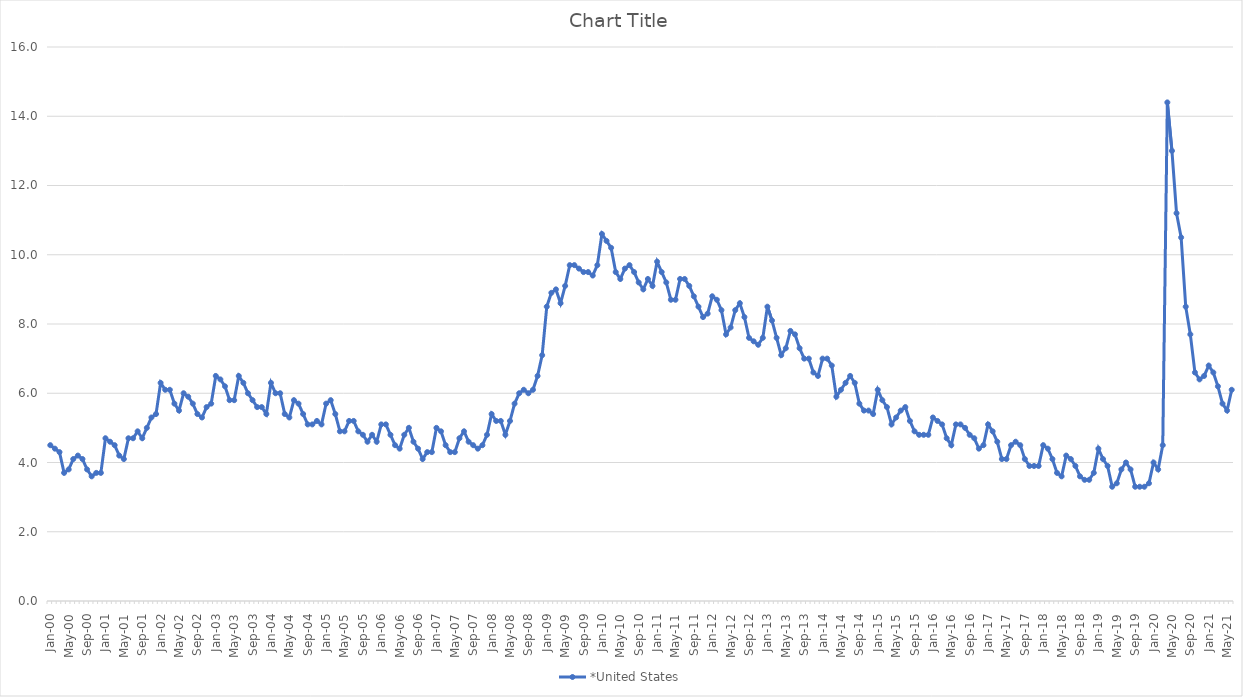
| Category | *United States | Alaska | Alabama | Arkansas | Arizona | California | Colorado | Connecticut | Delaware | Florida | Georgia | Hawaii | Iowa | Idaho | Illinois | Indiana | Kansas | Kentucky | Louisiana | Massachusetts | Maryland | Maine | Michigan | Minnesota | Missouri | Mississippi | Montana | North Carolina | North Dakota | Nebraska | New Hampshire | New Jersey | New Mexico | Nevada | New York | Ohio | Oklahoma | Oregon | Pennsylvania | Rhode Island | South Carolina | South Dakota | Tennessee | Texas | Utah | Virginia | Vermont | Washington | Wisconsin | West Virginia | Wyoming |
|---|---|---|---|---|---|---|---|---|---|---|---|---|---|---|---|---|---|---|---|---|---|---|---|---|---|---|---|---|---|---|---|---|---|---|---|---|---|---|---|---|---|---|---|---|---|---|---|---|---|---|---|
| Jan-00 | 4.5 |  |  |  |  |  |  |  |  |  |  |  |  |  |  |  |  |  |  |  |  |  |  |  |  |  |  |  |  |  |  |  |  |  |  |  |  |  |  |  |  |  |  |  |  |  |  |  |  |  |  |
| Feb-00 | 4.4 |  |  |  |  |  |  |  |  |  |  |  |  |  |  |  |  |  |  |  |  |  |  |  |  |  |  |  |  |  |  |  |  |  |  |  |  |  |  |  |  |  |  |  |  |  |  |  |  |  |  |
| Mar-00 | 4.3 |  |  |  |  |  |  |  |  |  |  |  |  |  |  |  |  |  |  |  |  |  |  |  |  |  |  |  |  |  |  |  |  |  |  |  |  |  |  |  |  |  |  |  |  |  |  |  |  |  |  |
| Apr-00 | 3.7 |  |  |  |  |  |  |  |  |  |  |  |  |  |  |  |  |  |  |  |  |  |  |  |  |  |  |  |  |  |  |  |  |  |  |  |  |  |  |  |  |  |  |  |  |  |  |  |  |  |  |
| May-00 | 3.8 |  |  |  |  |  |  |  |  |  |  |  |  |  |  |  |  |  |  |  |  |  |  |  |  |  |  |  |  |  |  |  |  |  |  |  |  |  |  |  |  |  |  |  |  |  |  |  |  |  |  |
| Jun-00 | 4.1 |  |  |  |  |  |  |  |  |  |  |  |  |  |  |  |  |  |  |  |  |  |  |  |  |  |  |  |  |  |  |  |  |  |  |  |  |  |  |  |  |  |  |  |  |  |  |  |  |  |  |
| Jul-00 | 4.2 |  |  |  |  |  |  |  |  |  |  |  |  |  |  |  |  |  |  |  |  |  |  |  |  |  |  |  |  |  |  |  |  |  |  |  |  |  |  |  |  |  |  |  |  |  |  |  |  |  |  |
| Aug-00 | 4.1 |  |  |  |  |  |  |  |  |  |  |  |  |  |  |  |  |  |  |  |  |  |  |  |  |  |  |  |  |  |  |  |  |  |  |  |  |  |  |  |  |  |  |  |  |  |  |  |  |  |  |
| Sep-00 | 3.8 |  |  |  |  |  |  |  |  |  |  |  |  |  |  |  |  |  |  |  |  |  |  |  |  |  |  |  |  |  |  |  |  |  |  |  |  |  |  |  |  |  |  |  |  |  |  |  |  |  |  |
| Oct-00 | 3.6 |  |  |  |  |  |  |  |  |  |  |  |  |  |  |  |  |  |  |  |  |  |  |  |  |  |  |  |  |  |  |  |  |  |  |  |  |  |  |  |  |  |  |  |  |  |  |  |  |  |  |
| Nov-00 | 3.7 |  |  |  |  |  |  |  |  |  |  |  |  |  |  |  |  |  |  |  |  |  |  |  |  |  |  |  |  |  |  |  |  |  |  |  |  |  |  |  |  |  |  |  |  |  |  |  |  |  |  |
| Dec-00 | 3.7 |  |  |  |  |  |  |  |  |  |  |  |  |  |  |  |  |  |  |  |  |  |  |  |  |  |  |  |  |  |  |  |  |  |  |  |  |  |  |  |  |  |  |  |  |  |  |  |  |  |  |
| Jan-01 | 4.7 |  |  |  |  |  |  |  |  |  |  |  |  |  |  |  |  |  |  |  |  |  |  |  |  |  |  |  |  |  |  |  |  |  |  |  |  |  |  |  |  |  |  |  |  |  |  |  |  |  |  |
| Feb-01 | 4.6 |  |  |  |  |  |  |  |  |  |  |  |  |  |  |  |  |  |  |  |  |  |  |  |  |  |  |  |  |  |  |  |  |  |  |  |  |  |  |  |  |  |  |  |  |  |  |  |  |  |  |
| Mar-01 | 4.5 |  |  |  |  |  |  |  |  |  |  |  |  |  |  |  |  |  |  |  |  |  |  |  |  |  |  |  |  |  |  |  |  |  |  |  |  |  |  |  |  |  |  |  |  |  |  |  |  |  |  |
| Apr-01 | 4.2 |  |  |  |  |  |  |  |  |  |  |  |  |  |  |  |  |  |  |  |  |  |  |  |  |  |  |  |  |  |  |  |  |  |  |  |  |  |  |  |  |  |  |  |  |  |  |  |  |  |  |
| May-01 | 4.1 |  |  |  |  |  |  |  |  |  |  |  |  |  |  |  |  |  |  |  |  |  |  |  |  |  |  |  |  |  |  |  |  |  |  |  |  |  |  |  |  |  |  |  |  |  |  |  |  |  |  |
| Jun-01 | 4.7 |  |  |  |  |  |  |  |  |  |  |  |  |  |  |  |  |  |  |  |  |  |  |  |  |  |  |  |  |  |  |  |  |  |  |  |  |  |  |  |  |  |  |  |  |  |  |  |  |  |  |
| Jul-01 | 4.7 |  |  |  |  |  |  |  |  |  |  |  |  |  |  |  |  |  |  |  |  |  |  |  |  |  |  |  |  |  |  |  |  |  |  |  |  |  |  |  |  |  |  |  |  |  |  |  |  |  |  |
| Aug-01 | 4.9 |  |  |  |  |  |  |  |  |  |  |  |  |  |  |  |  |  |  |  |  |  |  |  |  |  |  |  |  |  |  |  |  |  |  |  |  |  |  |  |  |  |  |  |  |  |  |  |  |  |  |
| Sep-01 | 4.7 |  |  |  |  |  |  |  |  |  |  |  |  |  |  |  |  |  |  |  |  |  |  |  |  |  |  |  |  |  |  |  |  |  |  |  |  |  |  |  |  |  |  |  |  |  |  |  |  |  |  |
| Oct-01 | 5 |  |  |  |  |  |  |  |  |  |  |  |  |  |  |  |  |  |  |  |  |  |  |  |  |  |  |  |  |  |  |  |  |  |  |  |  |  |  |  |  |  |  |  |  |  |  |  |  |  |  |
| Nov-01 | 5.3 |  |  |  |  |  |  |  |  |  |  |  |  |  |  |  |  |  |  |  |  |  |  |  |  |  |  |  |  |  |  |  |  |  |  |  |  |  |  |  |  |  |  |  |  |  |  |  |  |  |  |
| Dec-01 | 5.4 |  |  |  |  |  |  |  |  |  |  |  |  |  |  |  |  |  |  |  |  |  |  |  |  |  |  |  |  |  |  |  |  |  |  |  |  |  |  |  |  |  |  |  |  |  |  |  |  |  |  |
| Jan-02 | 6.3 |  |  |  |  |  |  |  |  |  |  |  |  |  |  |  |  |  |  |  |  |  |  |  |  |  |  |  |  |  |  |  |  |  |  |  |  |  |  |  |  |  |  |  |  |  |  |  |  |  |  |
| Feb-02 | 6.1 |  |  |  |  |  |  |  |  |  |  |  |  |  |  |  |  |  |  |  |  |  |  |  |  |  |  |  |  |  |  |  |  |  |  |  |  |  |  |  |  |  |  |  |  |  |  |  |  |  |  |
| Mar-02 | 6.1 |  |  |  |  |  |  |  |  |  |  |  |  |  |  |  |  |  |  |  |  |  |  |  |  |  |  |  |  |  |  |  |  |  |  |  |  |  |  |  |  |  |  |  |  |  |  |  |  |  |  |
| Apr-02 | 5.7 |  |  |  |  |  |  |  |  |  |  |  |  |  |  |  |  |  |  |  |  |  |  |  |  |  |  |  |  |  |  |  |  |  |  |  |  |  |  |  |  |  |  |  |  |  |  |  |  |  |  |
| May-02 | 5.5 |  |  |  |  |  |  |  |  |  |  |  |  |  |  |  |  |  |  |  |  |  |  |  |  |  |  |  |  |  |  |  |  |  |  |  |  |  |  |  |  |  |  |  |  |  |  |  |  |  |  |
| Jun-02 | 6 |  |  |  |  |  |  |  |  |  |  |  |  |  |  |  |  |  |  |  |  |  |  |  |  |  |  |  |  |  |  |  |  |  |  |  |  |  |  |  |  |  |  |  |  |  |  |  |  |  |  |
| Jul-02 | 5.9 |  |  |  |  |  |  |  |  |  |  |  |  |  |  |  |  |  |  |  |  |  |  |  |  |  |  |  |  |  |  |  |  |  |  |  |  |  |  |  |  |  |  |  |  |  |  |  |  |  |  |
| Aug-02 | 5.7 |  |  |  |  |  |  |  |  |  |  |  |  |  |  |  |  |  |  |  |  |  |  |  |  |  |  |  |  |  |  |  |  |  |  |  |  |  |  |  |  |  |  |  |  |  |  |  |  |  |  |
| Sep-02 | 5.4 |  |  |  |  |  |  |  |  |  |  |  |  |  |  |  |  |  |  |  |  |  |  |  |  |  |  |  |  |  |  |  |  |  |  |  |  |  |  |  |  |  |  |  |  |  |  |  |  |  |  |
| Oct-02 | 5.3 |  |  |  |  |  |  |  |  |  |  |  |  |  |  |  |  |  |  |  |  |  |  |  |  |  |  |  |  |  |  |  |  |  |  |  |  |  |  |  |  |  |  |  |  |  |  |  |  |  |  |
| Nov-02 | 5.6 |  |  |  |  |  |  |  |  |  |  |  |  |  |  |  |  |  |  |  |  |  |  |  |  |  |  |  |  |  |  |  |  |  |  |  |  |  |  |  |  |  |  |  |  |  |  |  |  |  |  |
| Dec-02 | 5.7 |  |  |  |  |  |  |  |  |  |  |  |  |  |  |  |  |  |  |  |  |  |  |  |  |  |  |  |  |  |  |  |  |  |  |  |  |  |  |  |  |  |  |  |  |  |  |  |  |  |  |
| Jan-03 | 6.5 |  |  |  |  |  |  |  |  |  |  |  |  |  |  |  |  |  |  |  |  |  |  |  |  |  |  |  |  |  |  |  |  |  |  |  |  |  |  |  |  |  |  |  |  |  |  |  |  |  |  |
| Feb-03 | 6.4 |  |  |  |  |  |  |  |  |  |  |  |  |  |  |  |  |  |  |  |  |  |  |  |  |  |  |  |  |  |  |  |  |  |  |  |  |  |  |  |  |  |  |  |  |  |  |  |  |  |  |
| Mar-03 | 6.2 |  |  |  |  |  |  |  |  |  |  |  |  |  |  |  |  |  |  |  |  |  |  |  |  |  |  |  |  |  |  |  |  |  |  |  |  |  |  |  |  |  |  |  |  |  |  |  |  |  |  |
| Apr-03 | 5.8 |  |  |  |  |  |  |  |  |  |  |  |  |  |  |  |  |  |  |  |  |  |  |  |  |  |  |  |  |  |  |  |  |  |  |  |  |  |  |  |  |  |  |  |  |  |  |  |  |  |  |
| May-03 | 5.8 |  |  |  |  |  |  |  |  |  |  |  |  |  |  |  |  |  |  |  |  |  |  |  |  |  |  |  |  |  |  |  |  |  |  |  |  |  |  |  |  |  |  |  |  |  |  |  |  |  |  |
| Jun-03 | 6.5 |  |  |  |  |  |  |  |  |  |  |  |  |  |  |  |  |  |  |  |  |  |  |  |  |  |  |  |  |  |  |  |  |  |  |  |  |  |  |  |  |  |  |  |  |  |  |  |  |  |  |
| Jul-03 | 6.3 |  |  |  |  |  |  |  |  |  |  |  |  |  |  |  |  |  |  |  |  |  |  |  |  |  |  |  |  |  |  |  |  |  |  |  |  |  |  |  |  |  |  |  |  |  |  |  |  |  |  |
| Aug-03 | 6 |  |  |  |  |  |  |  |  |  |  |  |  |  |  |  |  |  |  |  |  |  |  |  |  |  |  |  |  |  |  |  |  |  |  |  |  |  |  |  |  |  |  |  |  |  |  |  |  |  |  |
| Sep-03 | 5.8 |  |  |  |  |  |  |  |  |  |  |  |  |  |  |  |  |  |  |  |  |  |  |  |  |  |  |  |  |  |  |  |  |  |  |  |  |  |  |  |  |  |  |  |  |  |  |  |  |  |  |
| Oct-03 | 5.6 |  |  |  |  |  |  |  |  |  |  |  |  |  |  |  |  |  |  |  |  |  |  |  |  |  |  |  |  |  |  |  |  |  |  |  |  |  |  |  |  |  |  |  |  |  |  |  |  |  |  |
| Nov-03 | 5.6 |  |  |  |  |  |  |  |  |  |  |  |  |  |  |  |  |  |  |  |  |  |  |  |  |  |  |  |  |  |  |  |  |  |  |  |  |  |  |  |  |  |  |  |  |  |  |  |  |  |  |
| Dec-03 | 5.4 |  |  |  |  |  |  |  |  |  |  |  |  |  |  |  |  |  |  |  |  |  |  |  |  |  |  |  |  |  |  |  |  |  |  |  |  |  |  |  |  |  |  |  |  |  |  |  |  |  |  |
| Jan-04 | 6.3 |  |  |  |  |  |  |  |  |  |  |  |  |  |  |  |  |  |  |  |  |  |  |  |  |  |  |  |  |  |  |  |  |  |  |  |  |  |  |  |  |  |  |  |  |  |  |  |  |  |  |
| Feb-04 | 6 |  |  |  |  |  |  |  |  |  |  |  |  |  |  |  |  |  |  |  |  |  |  |  |  |  |  |  |  |  |  |  |  |  |  |  |  |  |  |  |  |  |  |  |  |  |  |  |  |  |  |
| Mar-04 | 6 |  |  |  |  |  |  |  |  |  |  |  |  |  |  |  |  |  |  |  |  |  |  |  |  |  |  |  |  |  |  |  |  |  |  |  |  |  |  |  |  |  |  |  |  |  |  |  |  |  |  |
| Apr-04 | 5.4 |  |  |  |  |  |  |  |  |  |  |  |  |  |  |  |  |  |  |  |  |  |  |  |  |  |  |  |  |  |  |  |  |  |  |  |  |  |  |  |  |  |  |  |  |  |  |  |  |  |  |
| May-04 | 5.3 |  |  |  |  |  |  |  |  |  |  |  |  |  |  |  |  |  |  |  |  |  |  |  |  |  |  |  |  |  |  |  |  |  |  |  |  |  |  |  |  |  |  |  |  |  |  |  |  |  |  |
| Jun-04 | 5.8 |  |  |  |  |  |  |  |  |  |  |  |  |  |  |  |  |  |  |  |  |  |  |  |  |  |  |  |  |  |  |  |  |  |  |  |  |  |  |  |  |  |  |  |  |  |  |  |  |  |  |
| Jul-04 | 5.7 |  |  |  |  |  |  |  |  |  |  |  |  |  |  |  |  |  |  |  |  |  |  |  |  |  |  |  |  |  |  |  |  |  |  |  |  |  |  |  |  |  |  |  |  |  |  |  |  |  |  |
| Aug-04 | 5.4 |  |  |  |  |  |  |  |  |  |  |  |  |  |  |  |  |  |  |  |  |  |  |  |  |  |  |  |  |  |  |  |  |  |  |  |  |  |  |  |  |  |  |  |  |  |  |  |  |  |  |
| Sep-04 | 5.1 |  |  |  |  |  |  |  |  |  |  |  |  |  |  |  |  |  |  |  |  |  |  |  |  |  |  |  |  |  |  |  |  |  |  |  |  |  |  |  |  |  |  |  |  |  |  |  |  |  |  |
| Oct-04 | 5.1 |  |  |  |  |  |  |  |  |  |  |  |  |  |  |  |  |  |  |  |  |  |  |  |  |  |  |  |  |  |  |  |  |  |  |  |  |  |  |  |  |  |  |  |  |  |  |  |  |  |  |
| Nov-04 | 5.2 |  |  |  |  |  |  |  |  |  |  |  |  |  |  |  |  |  |  |  |  |  |  |  |  |  |  |  |  |  |  |  |  |  |  |  |  |  |  |  |  |  |  |  |  |  |  |  |  |  |  |
| Dec-04 | 5.1 |  |  |  |  |  |  |  |  |  |  |  |  |  |  |  |  |  |  |  |  |  |  |  |  |  |  |  |  |  |  |  |  |  |  |  |  |  |  |  |  |  |  |  |  |  |  |  |  |  |  |
| Jan-05 | 5.7 |  |  |  |  |  |  |  |  |  |  |  |  |  |  |  |  |  |  |  |  |  |  |  |  |  |  |  |  |  |  |  |  |  |  |  |  |  |  |  |  |  |  |  |  |  |  |  |  |  |  |
| Feb-05 | 5.8 |  |  |  |  |  |  |  |  |  |  |  |  |  |  |  |  |  |  |  |  |  |  |  |  |  |  |  |  |  |  |  |  |  |  |  |  |  |  |  |  |  |  |  |  |  |  |  |  |  |  |
| Mar-05 | 5.4 |  |  |  |  |  |  |  |  |  |  |  |  |  |  |  |  |  |  |  |  |  |  |  |  |  |  |  |  |  |  |  |  |  |  |  |  |  |  |  |  |  |  |  |  |  |  |  |  |  |  |
| Apr-05 | 4.9 |  |  |  |  |  |  |  |  |  |  |  |  |  |  |  |  |  |  |  |  |  |  |  |  |  |  |  |  |  |  |  |  |  |  |  |  |  |  |  |  |  |  |  |  |  |  |  |  |  |  |
| May-05 | 4.9 |  |  |  |  |  |  |  |  |  |  |  |  |  |  |  |  |  |  |  |  |  |  |  |  |  |  |  |  |  |  |  |  |  |  |  |  |  |  |  |  |  |  |  |  |  |  |  |  |  |  |
| Jun-05 | 5.2 |  |  |  |  |  |  |  |  |  |  |  |  |  |  |  |  |  |  |  |  |  |  |  |  |  |  |  |  |  |  |  |  |  |  |  |  |  |  |  |  |  |  |  |  |  |  |  |  |  |  |
| Jul-05 | 5.2 |  |  |  |  |  |  |  |  |  |  |  |  |  |  |  |  |  |  |  |  |  |  |  |  |  |  |  |  |  |  |  |  |  |  |  |  |  |  |  |  |  |  |  |  |  |  |  |  |  |  |
| Aug-05 | 4.9 |  |  |  |  |  |  |  |  |  |  |  |  |  |  |  |  |  |  |  |  |  |  |  |  |  |  |  |  |  |  |  |  |  |  |  |  |  |  |  |  |  |  |  |  |  |  |  |  |  |  |
| Sep-05 | 4.8 |  |  |  |  |  |  |  |  |  |  |  |  |  |  |  |  |  |  |  |  |  |  |  |  |  |  |  |  |  |  |  |  |  |  |  |  |  |  |  |  |  |  |  |  |  |  |  |  |  |  |
| Oct-05 | 4.6 |  |  |  |  |  |  |  |  |  |  |  |  |  |  |  |  |  |  |  |  |  |  |  |  |  |  |  |  |  |  |  |  |  |  |  |  |  |  |  |  |  |  |  |  |  |  |  |  |  |  |
| Nov-05 | 4.8 |  |  |  |  |  |  |  |  |  |  |  |  |  |  |  |  |  |  |  |  |  |  |  |  |  |  |  |  |  |  |  |  |  |  |  |  |  |  |  |  |  |  |  |  |  |  |  |  |  |  |
| Dec-05 | 4.6 |  |  |  |  |  |  |  |  |  |  |  |  |  |  |  |  |  |  |  |  |  |  |  |  |  |  |  |  |  |  |  |  |  |  |  |  |  |  |  |  |  |  |  |  |  |  |  |  |  |  |
| Jan-06 | 5.1 |  |  |  |  |  |  |  |  |  |  |  |  |  |  |  |  |  |  |  |  |  |  |  |  |  |  |  |  |  |  |  |  |  |  |  |  |  |  |  |  |  |  |  |  |  |  |  |  |  |  |
| Feb-06 | 5.1 |  |  |  |  |  |  |  |  |  |  |  |  |  |  |  |  |  |  |  |  |  |  |  |  |  |  |  |  |  |  |  |  |  |  |  |  |  |  |  |  |  |  |  |  |  |  |  |  |  |  |
| Mar-06 | 4.8 |  |  |  |  |  |  |  |  |  |  |  |  |  |  |  |  |  |  |  |  |  |  |  |  |  |  |  |  |  |  |  |  |  |  |  |  |  |  |  |  |  |  |  |  |  |  |  |  |  |  |
| Apr-06 | 4.5 |  |  |  |  |  |  |  |  |  |  |  |  |  |  |  |  |  |  |  |  |  |  |  |  |  |  |  |  |  |  |  |  |  |  |  |  |  |  |  |  |  |  |  |  |  |  |  |  |  |  |
| May-06 | 4.4 |  |  |  |  |  |  |  |  |  |  |  |  |  |  |  |  |  |  |  |  |  |  |  |  |  |  |  |  |  |  |  |  |  |  |  |  |  |  |  |  |  |  |  |  |  |  |  |  |  |  |
| Jun-06 | 4.8 |  |  |  |  |  |  |  |  |  |  |  |  |  |  |  |  |  |  |  |  |  |  |  |  |  |  |  |  |  |  |  |  |  |  |  |  |  |  |  |  |  |  |  |  |  |  |  |  |  |  |
| Jul-06 | 5 |  |  |  |  |  |  |  |  |  |  |  |  |  |  |  |  |  |  |  |  |  |  |  |  |  |  |  |  |  |  |  |  |  |  |  |  |  |  |  |  |  |  |  |  |  |  |  |  |  |  |
| Aug-06 | 4.6 |  |  |  |  |  |  |  |  |  |  |  |  |  |  |  |  |  |  |  |  |  |  |  |  |  |  |  |  |  |  |  |  |  |  |  |  |  |  |  |  |  |  |  |  |  |  |  |  |  |  |
| Sep-06 | 4.4 |  |  |  |  |  |  |  |  |  |  |  |  |  |  |  |  |  |  |  |  |  |  |  |  |  |  |  |  |  |  |  |  |  |  |  |  |  |  |  |  |  |  |  |  |  |  |  |  |  |  |
| Oct-06 | 4.1 |  |  |  |  |  |  |  |  |  |  |  |  |  |  |  |  |  |  |  |  |  |  |  |  |  |  |  |  |  |  |  |  |  |  |  |  |  |  |  |  |  |  |  |  |  |  |  |  |  |  |
| Nov-06 | 4.3 |  |  |  |  |  |  |  |  |  |  |  |  |  |  |  |  |  |  |  |  |  |  |  |  |  |  |  |  |  |  |  |  |  |  |  |  |  |  |  |  |  |  |  |  |  |  |  |  |  |  |
| Dec-06 | 4.3 |  |  |  |  |  |  |  |  |  |  |  |  |  |  |  |  |  |  |  |  |  |  |  |  |  |  |  |  |  |  |  |  |  |  |  |  |  |  |  |  |  |  |  |  |  |  |  |  |  |  |
| Jan-07 | 5 |  |  |  |  |  |  |  |  |  |  |  |  |  |  |  |  |  |  |  |  |  |  |  |  |  |  |  |  |  |  |  |  |  |  |  |  |  |  |  |  |  |  |  |  |  |  |  |  |  |  |
| Feb-07 | 4.9 |  |  |  |  |  |  |  |  |  |  |  |  |  |  |  |  |  |  |  |  |  |  |  |  |  |  |  |  |  |  |  |  |  |  |  |  |  |  |  |  |  |  |  |  |  |  |  |  |  |  |
| Mar-07 | 4.5 |  |  |  |  |  |  |  |  |  |  |  |  |  |  |  |  |  |  |  |  |  |  |  |  |  |  |  |  |  |  |  |  |  |  |  |  |  |  |  |  |  |  |  |  |  |  |  |  |  |  |
| Apr-07 | 4.3 |  |  |  |  |  |  |  |  |  |  |  |  |  |  |  |  |  |  |  |  |  |  |  |  |  |  |  |  |  |  |  |  |  |  |  |  |  |  |  |  |  |  |  |  |  |  |  |  |  |  |
| May-07 | 4.3 |  |  |  |  |  |  |  |  |  |  |  |  |  |  |  |  |  |  |  |  |  |  |  |  |  |  |  |  |  |  |  |  |  |  |  |  |  |  |  |  |  |  |  |  |  |  |  |  |  |  |
| Jun-07 | 4.7 |  |  |  |  |  |  |  |  |  |  |  |  |  |  |  |  |  |  |  |  |  |  |  |  |  |  |  |  |  |  |  |  |  |  |  |  |  |  |  |  |  |  |  |  |  |  |  |  |  |  |
| Jul-07 | 4.9 |  |  |  |  |  |  |  |  |  |  |  |  |  |  |  |  |  |  |  |  |  |  |  |  |  |  |  |  |  |  |  |  |  |  |  |  |  |  |  |  |  |  |  |  |  |  |  |  |  |  |
| Aug-07 | 4.6 |  |  |  |  |  |  |  |  |  |  |  |  |  |  |  |  |  |  |  |  |  |  |  |  |  |  |  |  |  |  |  |  |  |  |  |  |  |  |  |  |  |  |  |  |  |  |  |  |  |  |
| Sep-07 | 4.5 |  |  |  |  |  |  |  |  |  |  |  |  |  |  |  |  |  |  |  |  |  |  |  |  |  |  |  |  |  |  |  |  |  |  |  |  |  |  |  |  |  |  |  |  |  |  |  |  |  |  |
| Oct-07 | 4.4 |  |  |  |  |  |  |  |  |  |  |  |  |  |  |  |  |  |  |  |  |  |  |  |  |  |  |  |  |  |  |  |  |  |  |  |  |  |  |  |  |  |  |  |  |  |  |  |  |  |  |
| Nov-07 | 4.5 |  |  |  |  |  |  |  |  |  |  |  |  |  |  |  |  |  |  |  |  |  |  |  |  |  |  |  |  |  |  |  |  |  |  |  |  |  |  |  |  |  |  |  |  |  |  |  |  |  |  |
| Dec-07 | 4.8 |  |  |  |  |  |  |  |  |  |  |  |  |  |  |  |  |  |  |  |  |  |  |  |  |  |  |  |  |  |  |  |  |  |  |  |  |  |  |  |  |  |  |  |  |  |  |  |  |  |  |
| Jan-08 | 5.4 |  |  |  |  |  |  |  |  |  |  |  |  |  |  |  |  |  |  |  |  |  |  |  |  |  |  |  |  |  |  |  |  |  |  |  |  |  |  |  |  |  |  |  |  |  |  |  |  |  |  |
| Feb-08 | 5.2 |  |  |  |  |  |  |  |  |  |  |  |  |  |  |  |  |  |  |  |  |  |  |  |  |  |  |  |  |  |  |  |  |  |  |  |  |  |  |  |  |  |  |  |  |  |  |  |  |  |  |
| Mar-08 | 5.2 |  |  |  |  |  |  |  |  |  |  |  |  |  |  |  |  |  |  |  |  |  |  |  |  |  |  |  |  |  |  |  |  |  |  |  |  |  |  |  |  |  |  |  |  |  |  |  |  |  |  |
| Apr-08 | 4.8 |  |  |  |  |  |  |  |  |  |  |  |  |  |  |  |  |  |  |  |  |  |  |  |  |  |  |  |  |  |  |  |  |  |  |  |  |  |  |  |  |  |  |  |  |  |  |  |  |  |  |
| May-08 | 5.2 |  |  |  |  |  |  |  |  |  |  |  |  |  |  |  |  |  |  |  |  |  |  |  |  |  |  |  |  |  |  |  |  |  |  |  |  |  |  |  |  |  |  |  |  |  |  |  |  |  |  |
| Jun-08 | 5.7 |  |  |  |  |  |  |  |  |  |  |  |  |  |  |  |  |  |  |  |  |  |  |  |  |  |  |  |  |  |  |  |  |  |  |  |  |  |  |  |  |  |  |  |  |  |  |  |  |  |  |
| Jul-08 | 6 |  |  |  |  |  |  |  |  |  |  |  |  |  |  |  |  |  |  |  |  |  |  |  |  |  |  |  |  |  |  |  |  |  |  |  |  |  |  |  |  |  |  |  |  |  |  |  |  |  |  |
| Aug-08 | 6.1 |  |  |  |  |  |  |  |  |  |  |  |  |  |  |  |  |  |  |  |  |  |  |  |  |  |  |  |  |  |  |  |  |  |  |  |  |  |  |  |  |  |  |  |  |  |  |  |  |  |  |
| Sep-08 | 6 |  |  |  |  |  |  |  |  |  |  |  |  |  |  |  |  |  |  |  |  |  |  |  |  |  |  |  |  |  |  |  |  |  |  |  |  |  |  |  |  |  |  |  |  |  |  |  |  |  |  |
| Oct-08 | 6.1 |  |  |  |  |  |  |  |  |  |  |  |  |  |  |  |  |  |  |  |  |  |  |  |  |  |  |  |  |  |  |  |  |  |  |  |  |  |  |  |  |  |  |  |  |  |  |  |  |  |  |
| Nov-08 | 6.5 |  |  |  |  |  |  |  |  |  |  |  |  |  |  |  |  |  |  |  |  |  |  |  |  |  |  |  |  |  |  |  |  |  |  |  |  |  |  |  |  |  |  |  |  |  |  |  |  |  |  |
| Dec-08 | 7.1 |  |  |  |  |  |  |  |  |  |  |  |  |  |  |  |  |  |  |  |  |  |  |  |  |  |  |  |  |  |  |  |  |  |  |  |  |  |  |  |  |  |  |  |  |  |  |  |  |  |  |
| Jan-09 | 8.5 |  |  |  |  |  |  |  |  |  |  |  |  |  |  |  |  |  |  |  |  |  |  |  |  |  |  |  |  |  |  |  |  |  |  |  |  |  |  |  |  |  |  |  |  |  |  |  |  |  |  |
| Feb-09 | 8.9 |  |  |  |  |  |  |  |  |  |  |  |  |  |  |  |  |  |  |  |  |  |  |  |  |  |  |  |  |  |  |  |  |  |  |  |  |  |  |  |  |  |  |  |  |  |  |  |  |  |  |
| Mar-09 | 9 |  |  |  |  |  |  |  |  |  |  |  |  |  |  |  |  |  |  |  |  |  |  |  |  |  |  |  |  |  |  |  |  |  |  |  |  |  |  |  |  |  |  |  |  |  |  |  |  |  |  |
| Apr-09 | 8.6 |  |  |  |  |  |  |  |  |  |  |  |  |  |  |  |  |  |  |  |  |  |  |  |  |  |  |  |  |  |  |  |  |  |  |  |  |  |  |  |  |  |  |  |  |  |  |  |  |  |  |
| May-09 | 9.1 |  |  |  |  |  |  |  |  |  |  |  |  |  |  |  |  |  |  |  |  |  |  |  |  |  |  |  |  |  |  |  |  |  |  |  |  |  |  |  |  |  |  |  |  |  |  |  |  |  |  |
| Jun-09 | 9.7 |  |  |  |  |  |  |  |  |  |  |  |  |  |  |  |  |  |  |  |  |  |  |  |  |  |  |  |  |  |  |  |  |  |  |  |  |  |  |  |  |  |  |  |  |  |  |  |  |  |  |
| Jul-09 | 9.7 |  |  |  |  |  |  |  |  |  |  |  |  |  |  |  |  |  |  |  |  |  |  |  |  |  |  |  |  |  |  |  |  |  |  |  |  |  |  |  |  |  |  |  |  |  |  |  |  |  |  |
| Aug-09 | 9.6 |  |  |  |  |  |  |  |  |  |  |  |  |  |  |  |  |  |  |  |  |  |  |  |  |  |  |  |  |  |  |  |  |  |  |  |  |  |  |  |  |  |  |  |  |  |  |  |  |  |  |
| Sep-09 | 9.5 |  |  |  |  |  |  |  |  |  |  |  |  |  |  |  |  |  |  |  |  |  |  |  |  |  |  |  |  |  |  |  |  |  |  |  |  |  |  |  |  |  |  |  |  |  |  |  |  |  |  |
| Oct-09 | 9.5 |  |  |  |  |  |  |  |  |  |  |  |  |  |  |  |  |  |  |  |  |  |  |  |  |  |  |  |  |  |  |  |  |  |  |  |  |  |  |  |  |  |  |  |  |  |  |  |  |  |  |
| Nov-09 | 9.4 |  |  |  |  |  |  |  |  |  |  |  |  |  |  |  |  |  |  |  |  |  |  |  |  |  |  |  |  |  |  |  |  |  |  |  |  |  |  |  |  |  |  |  |  |  |  |  |  |  |  |
| Dec-09 | 9.7 |  |  |  |  |  |  |  |  |  |  |  |  |  |  |  |  |  |  |  |  |  |  |  |  |  |  |  |  |  |  |  |  |  |  |  |  |  |  |  |  |  |  |  |  |  |  |  |  |  |  |
| Jan-10 | 10.6 |  |  |  |  |  |  |  |  |  |  |  |  |  |  |  |  |  |  |  |  |  |  |  |  |  |  |  |  |  |  |  |  |  |  |  |  |  |  |  |  |  |  |  |  |  |  |  |  |  |  |
| Feb-10 | 10.4 |  |  |  |  |  |  |  |  |  |  |  |  |  |  |  |  |  |  |  |  |  |  |  |  |  |  |  |  |  |  |  |  |  |  |  |  |  |  |  |  |  |  |  |  |  |  |  |  |  |  |
| Mar-10 | 10.2 |  |  |  |  |  |  |  |  |  |  |  |  |  |  |  |  |  |  |  |  |  |  |  |  |  |  |  |  |  |  |  |  |  |  |  |  |  |  |  |  |  |  |  |  |  |  |  |  |  |  |
| Apr-10 | 9.5 |  |  |  |  |  |  |  |  |  |  |  |  |  |  |  |  |  |  |  |  |  |  |  |  |  |  |  |  |  |  |  |  |  |  |  |  |  |  |  |  |  |  |  |  |  |  |  |  |  |  |
| May-10 | 9.3 |  |  |  |  |  |  |  |  |  |  |  |  |  |  |  |  |  |  |  |  |  |  |  |  |  |  |  |  |  |  |  |  |  |  |  |  |  |  |  |  |  |  |  |  |  |  |  |  |  |  |
| Jun-10 | 9.6 |  |  |  |  |  |  |  |  |  |  |  |  |  |  |  |  |  |  |  |  |  |  |  |  |  |  |  |  |  |  |  |  |  |  |  |  |  |  |  |  |  |  |  |  |  |  |  |  |  |  |
| Jul-10 | 9.7 |  |  |  |  |  |  |  |  |  |  |  |  |  |  |  |  |  |  |  |  |  |  |  |  |  |  |  |  |  |  |  |  |  |  |  |  |  |  |  |  |  |  |  |  |  |  |  |  |  |  |
| Aug-10 | 9.5 |  |  |  |  |  |  |  |  |  |  |  |  |  |  |  |  |  |  |  |  |  |  |  |  |  |  |  |  |  |  |  |  |  |  |  |  |  |  |  |  |  |  |  |  |  |  |  |  |  |  |
| Sep-10 | 9.2 |  |  |  |  |  |  |  |  |  |  |  |  |  |  |  |  |  |  |  |  |  |  |  |  |  |  |  |  |  |  |  |  |  |  |  |  |  |  |  |  |  |  |  |  |  |  |  |  |  |  |
| Oct-10 | 9 |  |  |  |  |  |  |  |  |  |  |  |  |  |  |  |  |  |  |  |  |  |  |  |  |  |  |  |  |  |  |  |  |  |  |  |  |  |  |  |  |  |  |  |  |  |  |  |  |  |  |
| Nov-10 | 9.3 |  |  |  |  |  |  |  |  |  |  |  |  |  |  |  |  |  |  |  |  |  |  |  |  |  |  |  |  |  |  |  |  |  |  |  |  |  |  |  |  |  |  |  |  |  |  |  |  |  |  |
| Dec-10 | 9.1 |  |  |  |  |  |  |  |  |  |  |  |  |  |  |  |  |  |  |  |  |  |  |  |  |  |  |  |  |  |  |  |  |  |  |  |  |  |  |  |  |  |  |  |  |  |  |  |  |  |  |
| Jan-11 | 9.8 |  |  |  |  |  |  |  |  |  |  |  |  |  |  |  |  |  |  |  |  |  |  |  |  |  |  |  |  |  |  |  |  |  |  |  |  |  |  |  |  |  |  |  |  |  |  |  |  |  |  |
| Feb-11 | 9.5 |  |  |  |  |  |  |  |  |  |  |  |  |  |  |  |  |  |  |  |  |  |  |  |  |  |  |  |  |  |  |  |  |  |  |  |  |  |  |  |  |  |  |  |  |  |  |  |  |  |  |
| Mar-11 | 9.2 |  |  |  |  |  |  |  |  |  |  |  |  |  |  |  |  |  |  |  |  |  |  |  |  |  |  |  |  |  |  |  |  |  |  |  |  |  |  |  |  |  |  |  |  |  |  |  |  |  |  |
| Apr-11 | 8.7 |  |  |  |  |  |  |  |  |  |  |  |  |  |  |  |  |  |  |  |  |  |  |  |  |  |  |  |  |  |  |  |  |  |  |  |  |  |  |  |  |  |  |  |  |  |  |  |  |  |  |
| May-11 | 8.7 |  |  |  |  |  |  |  |  |  |  |  |  |  |  |  |  |  |  |  |  |  |  |  |  |  |  |  |  |  |  |  |  |  |  |  |  |  |  |  |  |  |  |  |  |  |  |  |  |  |  |
| Jun-11 | 9.3 |  |  |  |  |  |  |  |  |  |  |  |  |  |  |  |  |  |  |  |  |  |  |  |  |  |  |  |  |  |  |  |  |  |  |  |  |  |  |  |  |  |  |  |  |  |  |  |  |  |  |
| Jul-11 | 9.3 |  |  |  |  |  |  |  |  |  |  |  |  |  |  |  |  |  |  |  |  |  |  |  |  |  |  |  |  |  |  |  |  |  |  |  |  |  |  |  |  |  |  |  |  |  |  |  |  |  |  |
| Aug-11 | 9.1 |  |  |  |  |  |  |  |  |  |  |  |  |  |  |  |  |  |  |  |  |  |  |  |  |  |  |  |  |  |  |  |  |  |  |  |  |  |  |  |  |  |  |  |  |  |  |  |  |  |  |
| Sep-11 | 8.8 |  |  |  |  |  |  |  |  |  |  |  |  |  |  |  |  |  |  |  |  |  |  |  |  |  |  |  |  |  |  |  |  |  |  |  |  |  |  |  |  |  |  |  |  |  |  |  |  |  |  |
| Oct-11 | 8.5 |  |  |  |  |  |  |  |  |  |  |  |  |  |  |  |  |  |  |  |  |  |  |  |  |  |  |  |  |  |  |  |  |  |  |  |  |  |  |  |  |  |  |  |  |  |  |  |  |  |  |
| Nov-11 | 8.2 |  |  |  |  |  |  |  |  |  |  |  |  |  |  |  |  |  |  |  |  |  |  |  |  |  |  |  |  |  |  |  |  |  |  |  |  |  |  |  |  |  |  |  |  |  |  |  |  |  |  |
| Dec-11 | 8.3 |  |  |  |  |  |  |  |  |  |  |  |  |  |  |  |  |  |  |  |  |  |  |  |  |  |  |  |  |  |  |  |  |  |  |  |  |  |  |  |  |  |  |  |  |  |  |  |  |  |  |
| Jan-12 | 8.8 |  |  |  |  |  |  |  |  |  |  |  |  |  |  |  |  |  |  |  |  |  |  |  |  |  |  |  |  |  |  |  |  |  |  |  |  |  |  |  |  |  |  |  |  |  |  |  |  |  |  |
| Feb-12 | 8.7 |  |  |  |  |  |  |  |  |  |  |  |  |  |  |  |  |  |  |  |  |  |  |  |  |  |  |  |  |  |  |  |  |  |  |  |  |  |  |  |  |  |  |  |  |  |  |  |  |  |  |
| Mar-12 | 8.4 |  |  |  |  |  |  |  |  |  |  |  |  |  |  |  |  |  |  |  |  |  |  |  |  |  |  |  |  |  |  |  |  |  |  |  |  |  |  |  |  |  |  |  |  |  |  |  |  |  |  |
| Apr-12 | 7.7 |  |  |  |  |  |  |  |  |  |  |  |  |  |  |  |  |  |  |  |  |  |  |  |  |  |  |  |  |  |  |  |  |  |  |  |  |  |  |  |  |  |  |  |  |  |  |  |  |  |  |
| May-12 | 7.9 |  |  |  |  |  |  |  |  |  |  |  |  |  |  |  |  |  |  |  |  |  |  |  |  |  |  |  |  |  |  |  |  |  |  |  |  |  |  |  |  |  |  |  |  |  |  |  |  |  |  |
| Jun-12 | 8.4 |  |  |  |  |  |  |  |  |  |  |  |  |  |  |  |  |  |  |  |  |  |  |  |  |  |  |  |  |  |  |  |  |  |  |  |  |  |  |  |  |  |  |  |  |  |  |  |  |  |  |
| Jul-12 | 8.6 |  |  |  |  |  |  |  |  |  |  |  |  |  |  |  |  |  |  |  |  |  |  |  |  |  |  |  |  |  |  |  |  |  |  |  |  |  |  |  |  |  |  |  |  |  |  |  |  |  |  |
| Aug-12 | 8.2 |  |  |  |  |  |  |  |  |  |  |  |  |  |  |  |  |  |  |  |  |  |  |  |  |  |  |  |  |  |  |  |  |  |  |  |  |  |  |  |  |  |  |  |  |  |  |  |  |  |  |
| Sep-12 | 7.6 |  |  |  |  |  |  |  |  |  |  |  |  |  |  |  |  |  |  |  |  |  |  |  |  |  |  |  |  |  |  |  |  |  |  |  |  |  |  |  |  |  |  |  |  |  |  |  |  |  |  |
| Oct-12 | 7.5 |  |  |  |  |  |  |  |  |  |  |  |  |  |  |  |  |  |  |  |  |  |  |  |  |  |  |  |  |  |  |  |  |  |  |  |  |  |  |  |  |  |  |  |  |  |  |  |  |  |  |
| Nov-12 | 7.4 |  |  |  |  |  |  |  |  |  |  |  |  |  |  |  |  |  |  |  |  |  |  |  |  |  |  |  |  |  |  |  |  |  |  |  |  |  |  |  |  |  |  |  |  |  |  |  |  |  |  |
| Dec-12 | 7.6 |  |  |  |  |  |  |  |  |  |  |  |  |  |  |  |  |  |  |  |  |  |  |  |  |  |  |  |  |  |  |  |  |  |  |  |  |  |  |  |  |  |  |  |  |  |  |  |  |  |  |
| Jan-13 | 8.5 |  |  |  |  |  |  |  |  |  |  |  |  |  |  |  |  |  |  |  |  |  |  |  |  |  |  |  |  |  |  |  |  |  |  |  |  |  |  |  |  |  |  |  |  |  |  |  |  |  |  |
| Feb-13 | 8.1 |  |  |  |  |  |  |  |  |  |  |  |  |  |  |  |  |  |  |  |  |  |  |  |  |  |  |  |  |  |  |  |  |  |  |  |  |  |  |  |  |  |  |  |  |  |  |  |  |  |  |
| Mar-13 | 7.6 |  |  |  |  |  |  |  |  |  |  |  |  |  |  |  |  |  |  |  |  |  |  |  |  |  |  |  |  |  |  |  |  |  |  |  |  |  |  |  |  |  |  |  |  |  |  |  |  |  |  |
| Apr-13 | 7.1 |  |  |  |  |  |  |  |  |  |  |  |  |  |  |  |  |  |  |  |  |  |  |  |  |  |  |  |  |  |  |  |  |  |  |  |  |  |  |  |  |  |  |  |  |  |  |  |  |  |  |
| May-13 | 7.3 |  |  |  |  |  |  |  |  |  |  |  |  |  |  |  |  |  |  |  |  |  |  |  |  |  |  |  |  |  |  |  |  |  |  |  |  |  |  |  |  |  |  |  |  |  |  |  |  |  |  |
| Jun-13 | 7.8 |  |  |  |  |  |  |  |  |  |  |  |  |  |  |  |  |  |  |  |  |  |  |  |  |  |  |  |  |  |  |  |  |  |  |  |  |  |  |  |  |  |  |  |  |  |  |  |  |  |  |
| Jul-13 | 7.7 |  |  |  |  |  |  |  |  |  |  |  |  |  |  |  |  |  |  |  |  |  |  |  |  |  |  |  |  |  |  |  |  |  |  |  |  |  |  |  |  |  |  |  |  |  |  |  |  |  |  |
| Aug-13 | 7.3 |  |  |  |  |  |  |  |  |  |  |  |  |  |  |  |  |  |  |  |  |  |  |  |  |  |  |  |  |  |  |  |  |  |  |  |  |  |  |  |  |  |  |  |  |  |  |  |  |  |  |
| Sep-13 | 7 |  |  |  |  |  |  |  |  |  |  |  |  |  |  |  |  |  |  |  |  |  |  |  |  |  |  |  |  |  |  |  |  |  |  |  |  |  |  |  |  |  |  |  |  |  |  |  |  |  |  |
| Oct-13 | 7 |  |  |  |  |  |  |  |  |  |  |  |  |  |  |  |  |  |  |  |  |  |  |  |  |  |  |  |  |  |  |  |  |  |  |  |  |  |  |  |  |  |  |  |  |  |  |  |  |  |  |
| Nov-13 | 6.6 |  |  |  |  |  |  |  |  |  |  |  |  |  |  |  |  |  |  |  |  |  |  |  |  |  |  |  |  |  |  |  |  |  |  |  |  |  |  |  |  |  |  |  |  |  |  |  |  |  |  |
| Dec-13 | 6.5 |  |  |  |  |  |  |  |  |  |  |  |  |  |  |  |  |  |  |  |  |  |  |  |  |  |  |  |  |  |  |  |  |  |  |  |  |  |  |  |  |  |  |  |  |  |  |  |  |  |  |
| Jan-14 | 7 |  |  |  |  |  |  |  |  |  |  |  |  |  |  |  |  |  |  |  |  |  |  |  |  |  |  |  |  |  |  |  |  |  |  |  |  |  |  |  |  |  |  |  |  |  |  |  |  |  |  |
| Feb-14 | 7 |  |  |  |  |  |  |  |  |  |  |  |  |  |  |  |  |  |  |  |  |  |  |  |  |  |  |  |  |  |  |  |  |  |  |  |  |  |  |  |  |  |  |  |  |  |  |  |  |  |  |
| Mar-14 | 6.8 |  |  |  |  |  |  |  |  |  |  |  |  |  |  |  |  |  |  |  |  |  |  |  |  |  |  |  |  |  |  |  |  |  |  |  |  |  |  |  |  |  |  |  |  |  |  |  |  |  |  |
| Apr-14 | 5.9 |  |  |  |  |  |  |  |  |  |  |  |  |  |  |  |  |  |  |  |  |  |  |  |  |  |  |  |  |  |  |  |  |  |  |  |  |  |  |  |  |  |  |  |  |  |  |  |  |  |  |
| May-14 | 6.1 |  |  |  |  |  |  |  |  |  |  |  |  |  |  |  |  |  |  |  |  |  |  |  |  |  |  |  |  |  |  |  |  |  |  |  |  |  |  |  |  |  |  |  |  |  |  |  |  |  |  |
| Jun-14 | 6.3 |  |  |  |  |  |  |  |  |  |  |  |  |  |  |  |  |  |  |  |  |  |  |  |  |  |  |  |  |  |  |  |  |  |  |  |  |  |  |  |  |  |  |  |  |  |  |  |  |  |  |
| Jul-14 | 6.5 |  |  |  |  |  |  |  |  |  |  |  |  |  |  |  |  |  |  |  |  |  |  |  |  |  |  |  |  |  |  |  |  |  |  |  |  |  |  |  |  |  |  |  |  |  |  |  |  |  |  |
| Aug-14 | 6.3 |  |  |  |  |  |  |  |  |  |  |  |  |  |  |  |  |  |  |  |  |  |  |  |  |  |  |  |  |  |  |  |  |  |  |  |  |  |  |  |  |  |  |  |  |  |  |  |  |  |  |
| Sep-14 | 5.7 |  |  |  |  |  |  |  |  |  |  |  |  |  |  |  |  |  |  |  |  |  |  |  |  |  |  |  |  |  |  |  |  |  |  |  |  |  |  |  |  |  |  |  |  |  |  |  |  |  |  |
| Oct-14 | 5.5 |  |  |  |  |  |  |  |  |  |  |  |  |  |  |  |  |  |  |  |  |  |  |  |  |  |  |  |  |  |  |  |  |  |  |  |  |  |  |  |  |  |  |  |  |  |  |  |  |  |  |
| Nov-14 | 5.5 |  |  |  |  |  |  |  |  |  |  |  |  |  |  |  |  |  |  |  |  |  |  |  |  |  |  |  |  |  |  |  |  |  |  |  |  |  |  |  |  |  |  |  |  |  |  |  |  |  |  |
| Dec-14 | 5.4 |  |  |  |  |  |  |  |  |  |  |  |  |  |  |  |  |  |  |  |  |  |  |  |  |  |  |  |  |  |  |  |  |  |  |  |  |  |  |  |  |  |  |  |  |  |  |  |  |  |  |
| Jan-15 | 6.1 |  |  |  |  |  |  |  |  |  |  |  |  |  |  |  |  |  |  |  |  |  |  |  |  |  |  |  |  |  |  |  |  |  |  |  |  |  |  |  |  |  |  |  |  |  |  |  |  |  |  |
| Feb-15 | 5.8 |  |  |  |  |  |  |  |  |  |  |  |  |  |  |  |  |  |  |  |  |  |  |  |  |  |  |  |  |  |  |  |  |  |  |  |  |  |  |  |  |  |  |  |  |  |  |  |  |  |  |
| Mar-15 | 5.6 |  |  |  |  |  |  |  |  |  |  |  |  |  |  |  |  |  |  |  |  |  |  |  |  |  |  |  |  |  |  |  |  |  |  |  |  |  |  |  |  |  |  |  |  |  |  |  |  |  |  |
| Apr-15 | 5.1 |  |  |  |  |  |  |  |  |  |  |  |  |  |  |  |  |  |  |  |  |  |  |  |  |  |  |  |  |  |  |  |  |  |  |  |  |  |  |  |  |  |  |  |  |  |  |  |  |  |  |
| May-15 | 5.3 |  |  |  |  |  |  |  |  |  |  |  |  |  |  |  |  |  |  |  |  |  |  |  |  |  |  |  |  |  |  |  |  |  |  |  |  |  |  |  |  |  |  |  |  |  |  |  |  |  |  |
| Jun-15 | 5.5 |  |  |  |  |  |  |  |  |  |  |  |  |  |  |  |  |  |  |  |  |  |  |  |  |  |  |  |  |  |  |  |  |  |  |  |  |  |  |  |  |  |  |  |  |  |  |  |  |  |  |
| Jul-15 | 5.6 |  |  |  |  |  |  |  |  |  |  |  |  |  |  |  |  |  |  |  |  |  |  |  |  |  |  |  |  |  |  |  |  |  |  |  |  |  |  |  |  |  |  |  |  |  |  |  |  |  |  |
| Aug-15 | 5.2 |  |  |  |  |  |  |  |  |  |  |  |  |  |  |  |  |  |  |  |  |  |  |  |  |  |  |  |  |  |  |  |  |  |  |  |  |  |  |  |  |  |  |  |  |  |  |  |  |  |  |
| Sep-15 | 4.9 |  |  |  |  |  |  |  |  |  |  |  |  |  |  |  |  |  |  |  |  |  |  |  |  |  |  |  |  |  |  |  |  |  |  |  |  |  |  |  |  |  |  |  |  |  |  |  |  |  |  |
| Oct-15 | 4.8 |  |  |  |  |  |  |  |  |  |  |  |  |  |  |  |  |  |  |  |  |  |  |  |  |  |  |  |  |  |  |  |  |  |  |  |  |  |  |  |  |  |  |  |  |  |  |  |  |  |  |
| Nov-15 | 4.8 |  |  |  |  |  |  |  |  |  |  |  |  |  |  |  |  |  |  |  |  |  |  |  |  |  |  |  |  |  |  |  |  |  |  |  |  |  |  |  |  |  |  |  |  |  |  |  |  |  |  |
| Dec-15 | 4.8 |  |  |  |  |  |  |  |  |  |  |  |  |  |  |  |  |  |  |  |  |  |  |  |  |  |  |  |  |  |  |  |  |  |  |  |  |  |  |  |  |  |  |  |  |  |  |  |  |  |  |
| Jan-16 | 5.3 |  |  |  |  |  |  |  |  |  |  |  |  |  |  |  |  |  |  |  |  |  |  |  |  |  |  |  |  |  |  |  |  |  |  |  |  |  |  |  |  |  |  |  |  |  |  |  |  |  |  |
| Feb-16 | 5.2 |  |  |  |  |  |  |  |  |  |  |  |  |  |  |  |  |  |  |  |  |  |  |  |  |  |  |  |  |  |  |  |  |  |  |  |  |  |  |  |  |  |  |  |  |  |  |  |  |  |  |
| Mar-16 | 5.1 |  |  |  |  |  |  |  |  |  |  |  |  |  |  |  |  |  |  |  |  |  |  |  |  |  |  |  |  |  |  |  |  |  |  |  |  |  |  |  |  |  |  |  |  |  |  |  |  |  |  |
| Apr-16 | 4.7 |  |  |  |  |  |  |  |  |  |  |  |  |  |  |  |  |  |  |  |  |  |  |  |  |  |  |  |  |  |  |  |  |  |  |  |  |  |  |  |  |  |  |  |  |  |  |  |  |  |  |
| May-16 | 4.5 |  |  |  |  |  |  |  |  |  |  |  |  |  |  |  |  |  |  |  |  |  |  |  |  |  |  |  |  |  |  |  |  |  |  |  |  |  |  |  |  |  |  |  |  |  |  |  |  |  |  |
| Jun-16 | 5.1 |  |  |  |  |  |  |  |  |  |  |  |  |  |  |  |  |  |  |  |  |  |  |  |  |  |  |  |  |  |  |  |  |  |  |  |  |  |  |  |  |  |  |  |  |  |  |  |  |  |  |
| Jul-16 | 5.1 |  |  |  |  |  |  |  |  |  |  |  |  |  |  |  |  |  |  |  |  |  |  |  |  |  |  |  |  |  |  |  |  |  |  |  |  |  |  |  |  |  |  |  |  |  |  |  |  |  |  |
| Aug-16 | 5 |  |  |  |  |  |  |  |  |  |  |  |  |  |  |  |  |  |  |  |  |  |  |  |  |  |  |  |  |  |  |  |  |  |  |  |  |  |  |  |  |  |  |  |  |  |  |  |  |  |  |
| Sep-16 | 4.8 |  |  |  |  |  |  |  |  |  |  |  |  |  |  |  |  |  |  |  |  |  |  |  |  |  |  |  |  |  |  |  |  |  |  |  |  |  |  |  |  |  |  |  |  |  |  |  |  |  |  |
| Oct-16 | 4.7 |  |  |  |  |  |  |  |  |  |  |  |  |  |  |  |  |  |  |  |  |  |  |  |  |  |  |  |  |  |  |  |  |  |  |  |  |  |  |  |  |  |  |  |  |  |  |  |  |  |  |
| Nov-16 | 4.4 |  |  |  |  |  |  |  |  |  |  |  |  |  |  |  |  |  |  |  |  |  |  |  |  |  |  |  |  |  |  |  |  |  |  |  |  |  |  |  |  |  |  |  |  |  |  |  |  |  |  |
| Dec-16 | 4.5 |  |  |  |  |  |  |  |  |  |  |  |  |  |  |  |  |  |  |  |  |  |  |  |  |  |  |  |  |  |  |  |  |  |  |  |  |  |  |  |  |  |  |  |  |  |  |  |  |  |  |
| Jan-17 | 5.1 |  |  |  |  |  |  |  |  |  |  |  |  |  |  |  |  |  |  |  |  |  |  |  |  |  |  |  |  |  |  |  |  |  |  |  |  |  |  |  |  |  |  |  |  |  |  |  |  |  |  |
| Feb-17 | 4.9 |  |  |  |  |  |  |  |  |  |  |  |  |  |  |  |  |  |  |  |  |  |  |  |  |  |  |  |  |  |  |  |  |  |  |  |  |  |  |  |  |  |  |  |  |  |  |  |  |  |  |
| Mar-17 | 4.6 |  |  |  |  |  |  |  |  |  |  |  |  |  |  |  |  |  |  |  |  |  |  |  |  |  |  |  |  |  |  |  |  |  |  |  |  |  |  |  |  |  |  |  |  |  |  |  |  |  |  |
| Apr-17 | 4.1 |  |  |  |  |  |  |  |  |  |  |  |  |  |  |  |  |  |  |  |  |  |  |  |  |  |  |  |  |  |  |  |  |  |  |  |  |  |  |  |  |  |  |  |  |  |  |  |  |  |  |
| May-17 | 4.1 |  |  |  |  |  |  |  |  |  |  |  |  |  |  |  |  |  |  |  |  |  |  |  |  |  |  |  |  |  |  |  |  |  |  |  |  |  |  |  |  |  |  |  |  |  |  |  |  |  |  |
| Jun-17 | 4.5 |  |  |  |  |  |  |  |  |  |  |  |  |  |  |  |  |  |  |  |  |  |  |  |  |  |  |  |  |  |  |  |  |  |  |  |  |  |  |  |  |  |  |  |  |  |  |  |  |  |  |
| Jul-17 | 4.6 |  |  |  |  |  |  |  |  |  |  |  |  |  |  |  |  |  |  |  |  |  |  |  |  |  |  |  |  |  |  |  |  |  |  |  |  |  |  |  |  |  |  |  |  |  |  |  |  |  |  |
| Aug-17 | 4.5 |  |  |  |  |  |  |  |  |  |  |  |  |  |  |  |  |  |  |  |  |  |  |  |  |  |  |  |  |  |  |  |  |  |  |  |  |  |  |  |  |  |  |  |  |  |  |  |  |  |  |
| Sep-17 | 4.1 |  |  |  |  |  |  |  |  |  |  |  |  |  |  |  |  |  |  |  |  |  |  |  |  |  |  |  |  |  |  |  |  |  |  |  |  |  |  |  |  |  |  |  |  |  |  |  |  |  |  |
| Oct-17 | 3.9 |  |  |  |  |  |  |  |  |  |  |  |  |  |  |  |  |  |  |  |  |  |  |  |  |  |  |  |  |  |  |  |  |  |  |  |  |  |  |  |  |  |  |  |  |  |  |  |  |  |  |
| Nov-17 | 3.9 |  |  |  |  |  |  |  |  |  |  |  |  |  |  |  |  |  |  |  |  |  |  |  |  |  |  |  |  |  |  |  |  |  |  |  |  |  |  |  |  |  |  |  |  |  |  |  |  |  |  |
| Dec-17 | 3.9 |  |  |  |  |  |  |  |  |  |  |  |  |  |  |  |  |  |  |  |  |  |  |  |  |  |  |  |  |  |  |  |  |  |  |  |  |  |  |  |  |  |  |  |  |  |  |  |  |  |  |
| Jan-18 | 4.5 |  |  |  |  |  |  |  |  |  |  |  |  |  |  |  |  |  |  |  |  |  |  |  |  |  |  |  |  |  |  |  |  |  |  |  |  |  |  |  |  |  |  |  |  |  |  |  |  |  |  |
| Feb-18 | 4.4 |  |  |  |  |  |  |  |  |  |  |  |  |  |  |  |  |  |  |  |  |  |  |  |  |  |  |  |  |  |  |  |  |  |  |  |  |  |  |  |  |  |  |  |  |  |  |  |  |  |  |
| Mar-18 | 4.1 |  |  |  |  |  |  |  |  |  |  |  |  |  |  |  |  |  |  |  |  |  |  |  |  |  |  |  |  |  |  |  |  |  |  |  |  |  |  |  |  |  |  |  |  |  |  |  |  |  |  |
| Apr-18 | 3.7 |  |  |  |  |  |  |  |  |  |  |  |  |  |  |  |  |  |  |  |  |  |  |  |  |  |  |  |  |  |  |  |  |  |  |  |  |  |  |  |  |  |  |  |  |  |  |  |  |  |  |
| May-18 | 3.6 |  |  |  |  |  |  |  |  |  |  |  |  |  |  |  |  |  |  |  |  |  |  |  |  |  |  |  |  |  |  |  |  |  |  |  |  |  |  |  |  |  |  |  |  |  |  |  |  |  |  |
| Jun-18 | 4.2 |  |  |  |  |  |  |  |  |  |  |  |  |  |  |  |  |  |  |  |  |  |  |  |  |  |  |  |  |  |  |  |  |  |  |  |  |  |  |  |  |  |  |  |  |  |  |  |  |  |  |
| Jul-18 | 4.1 |  |  |  |  |  |  |  |  |  |  |  |  |  |  |  |  |  |  |  |  |  |  |  |  |  |  |  |  |  |  |  |  |  |  |  |  |  |  |  |  |  |  |  |  |  |  |  |  |  |  |
| Aug-18 | 3.9 |  |  |  |  |  |  |  |  |  |  |  |  |  |  |  |  |  |  |  |  |  |  |  |  |  |  |  |  |  |  |  |  |  |  |  |  |  |  |  |  |  |  |  |  |  |  |  |  |  |  |
| Sep-18 | 3.6 |  |  |  |  |  |  |  |  |  |  |  |  |  |  |  |  |  |  |  |  |  |  |  |  |  |  |  |  |  |  |  |  |  |  |  |  |  |  |  |  |  |  |  |  |  |  |  |  |  |  |
| Oct-18 | 3.5 |  |  |  |  |  |  |  |  |  |  |  |  |  |  |  |  |  |  |  |  |  |  |  |  |  |  |  |  |  |  |  |  |  |  |  |  |  |  |  |  |  |  |  |  |  |  |  |  |  |  |
| Nov-18 | 3.5 |  |  |  |  |  |  |  |  |  |  |  |  |  |  |  |  |  |  |  |  |  |  |  |  |  |  |  |  |  |  |  |  |  |  |  |  |  |  |  |  |  |  |  |  |  |  |  |  |  |  |
| Dec-18 | 3.7 |  |  |  |  |  |  |  |  |  |  |  |  |  |  |  |  |  |  |  |  |  |  |  |  |  |  |  |  |  |  |  |  |  |  |  |  |  |  |  |  |  |  |  |  |  |  |  |  |  |  |
| Jan-19 | 4.4 |  |  |  |  |  |  |  |  |  |  |  |  |  |  |  |  |  |  |  |  |  |  |  |  |  |  |  |  |  |  |  |  |  |  |  |  |  |  |  |  |  |  |  |  |  |  |  |  |  |  |
| Feb-19 | 4.1 |  |  |  |  |  |  |  |  |  |  |  |  |  |  |  |  |  |  |  |  |  |  |  |  |  |  |  |  |  |  |  |  |  |  |  |  |  |  |  |  |  |  |  |  |  |  |  |  |  |  |
| Mar-19 | 3.9 |  |  |  |  |  |  |  |  |  |  |  |  |  |  |  |  |  |  |  |  |  |  |  |  |  |  |  |  |  |  |  |  |  |  |  |  |  |  |  |  |  |  |  |  |  |  |  |  |  |  |
| Apr-19 | 3.3 |  |  |  |  |  |  |  |  |  |  |  |  |  |  |  |  |  |  |  |  |  |  |  |  |  |  |  |  |  |  |  |  |  |  |  |  |  |  |  |  |  |  |  |  |  |  |  |  |  |  |
| May-19 | 3.4 |  |  |  |  |  |  |  |  |  |  |  |  |  |  |  |  |  |  |  |  |  |  |  |  |  |  |  |  |  |  |  |  |  |  |  |  |  |  |  |  |  |  |  |  |  |  |  |  |  |  |
| Jun-19 | 3.8 |  |  |  |  |  |  |  |  |  |  |  |  |  |  |  |  |  |  |  |  |  |  |  |  |  |  |  |  |  |  |  |  |  |  |  |  |  |  |  |  |  |  |  |  |  |  |  |  |  |  |
| Jul-19 | 4 |  |  |  |  |  |  |  |  |  |  |  |  |  |  |  |  |  |  |  |  |  |  |  |  |  |  |  |  |  |  |  |  |  |  |  |  |  |  |  |  |  |  |  |  |  |  |  |  |  |  |
| Aug-19 | 3.8 |  |  |  |  |  |  |  |  |  |  |  |  |  |  |  |  |  |  |  |  |  |  |  |  |  |  |  |  |  |  |  |  |  |  |  |  |  |  |  |  |  |  |  |  |  |  |  |  |  |  |
| Sep-19 | 3.3 |  |  |  |  |  |  |  |  |  |  |  |  |  |  |  |  |  |  |  |  |  |  |  |  |  |  |  |  |  |  |  |  |  |  |  |  |  |  |  |  |  |  |  |  |  |  |  |  |  |  |
| Oct-19 | 3.3 |  |  |  |  |  |  |  |  |  |  |  |  |  |  |  |  |  |  |  |  |  |  |  |  |  |  |  |  |  |  |  |  |  |  |  |  |  |  |  |  |  |  |  |  |  |  |  |  |  |  |
| Nov-19 | 3.3 |  |  |  |  |  |  |  |  |  |  |  |  |  |  |  |  |  |  |  |  |  |  |  |  |  |  |  |  |  |  |  |  |  |  |  |  |  |  |  |  |  |  |  |  |  |  |  |  |  |  |
| Dec-19 | 3.4 |  |  |  |  |  |  |  |  |  |  |  |  |  |  |  |  |  |  |  |  |  |  |  |  |  |  |  |  |  |  |  |  |  |  |  |  |  |  |  |  |  |  |  |  |  |  |  |  |  |  |
| Jan-20 | 4 |  |  |  |  |  |  |  |  |  |  |  |  |  |  |  |  |  |  |  |  |  |  |  |  |  |  |  |  |  |  |  |  |  |  |  |  |  |  |  |  |  |  |  |  |  |  |  |  |  |  |
| Feb-20 | 3.8 |  |  |  |  |  |  |  |  |  |  |  |  |  |  |  |  |  |  |  |  |  |  |  |  |  |  |  |  |  |  |  |  |  |  |  |  |  |  |  |  |  |  |  |  |  |  |  |  |  |  |
| Mar-20 | 4.5 |  |  |  |  |  |  |  |  |  |  |  |  |  |  |  |  |  |  |  |  |  |  |  |  |  |  |  |  |  |  |  |  |  |  |  |  |  |  |  |  |  |  |  |  |  |  |  |  |  |  |
| Apr-20 | 14.4 |  |  |  |  |  |  |  |  |  |  |  |  |  |  |  |  |  |  |  |  |  |  |  |  |  |  |  |  |  |  |  |  |  |  |  |  |  |  |  |  |  |  |  |  |  |  |  |  |  |  |
| May-20 | 13 |  |  |  |  |  |  |  |  |  |  |  |  |  |  |  |  |  |  |  |  |  |  |  |  |  |  |  |  |  |  |  |  |  |  |  |  |  |  |  |  |  |  |  |  |  |  |  |  |  |  |
| Jun-20 | 11.2 |  |  |  |  |  |  |  |  |  |  |  |  |  |  |  |  |  |  |  |  |  |  |  |  |  |  |  |  |  |  |  |  |  |  |  |  |  |  |  |  |  |  |  |  |  |  |  |  |  |  |
| Jul-20 | 10.5 |  |  |  |  |  |  |  |  |  |  |  |  |  |  |  |  |  |  |  |  |  |  |  |  |  |  |  |  |  |  |  |  |  |  |  |  |  |  |  |  |  |  |  |  |  |  |  |  |  |  |
| Aug-20 | 8.5 |  |  |  |  |  |  |  |  |  |  |  |  |  |  |  |  |  |  |  |  |  |  |  |  |  |  |  |  |  |  |  |  |  |  |  |  |  |  |  |  |  |  |  |  |  |  |  |  |  |  |
| Sep-20 | 7.7 |  |  |  |  |  |  |  |  |  |  |  |  |  |  |  |  |  |  |  |  |  |  |  |  |  |  |  |  |  |  |  |  |  |  |  |  |  |  |  |  |  |  |  |  |  |  |  |  |  |  |
| Oct-20 | 6.6 |  |  |  |  |  |  |  |  |  |  |  |  |  |  |  |  |  |  |  |  |  |  |  |  |  |  |  |  |  |  |  |  |  |  |  |  |  |  |  |  |  |  |  |  |  |  |  |  |  |  |
| Nov-20 | 6.4 |  |  |  |  |  |  |  |  |  |  |  |  |  |  |  |  |  |  |  |  |  |  |  |  |  |  |  |  |  |  |  |  |  |  |  |  |  |  |  |  |  |  |  |  |  |  |  |  |  |  |
| Dec-20 | 6.5 |  |  |  |  |  |  |  |  |  |  |  |  |  |  |  |  |  |  |  |  |  |  |  |  |  |  |  |  |  |  |  |  |  |  |  |  |  |  |  |  |  |  |  |  |  |  |  |  |  |  |
| Jan-21 | 6.8 |  |  |  |  |  |  |  |  |  |  |  |  |  |  |  |  |  |  |  |  |  |  |  |  |  |  |  |  |  |  |  |  |  |  |  |  |  |  |  |  |  |  |  |  |  |  |  |  |  |  |
| Feb-21 | 6.6 |  |  |  |  |  |  |  |  |  |  |  |  |  |  |  |  |  |  |  |  |  |  |  |  |  |  |  |  |  |  |  |  |  |  |  |  |  |  |  |  |  |  |  |  |  |  |  |  |  |  |
| Mar-21 | 6.2 |  |  |  |  |  |  |  |  |  |  |  |  |  |  |  |  |  |  |  |  |  |  |  |  |  |  |  |  |  |  |  |  |  |  |  |  |  |  |  |  |  |  |  |  |  |  |  |  |  |  |
| Apr-21 | 5.7 |  |  |  |  |  |  |  |  |  |  |  |  |  |  |  |  |  |  |  |  |  |  |  |  |  |  |  |  |  |  |  |  |  |  |  |  |  |  |  |  |  |  |  |  |  |  |  |  |  |  |
| May-21 | 5.5 |  |  |  |  |  |  |  |  |  |  |  |  |  |  |  |  |  |  |  |  |  |  |  |  |  |  |  |  |  |  |  |  |  |  |  |  |  |  |  |  |  |  |  |  |  |  |  |  |  |  |
| Jun-21 | 6.1 |  |  |  |  |  |  |  |  |  |  |  |  |  |  |  |  |  |  |  |  |  |  |  |  |  |  |  |  |  |  |  |  |  |  |  |  |  |  |  |  |  |  |  |  |  |  |  |  |  |  |